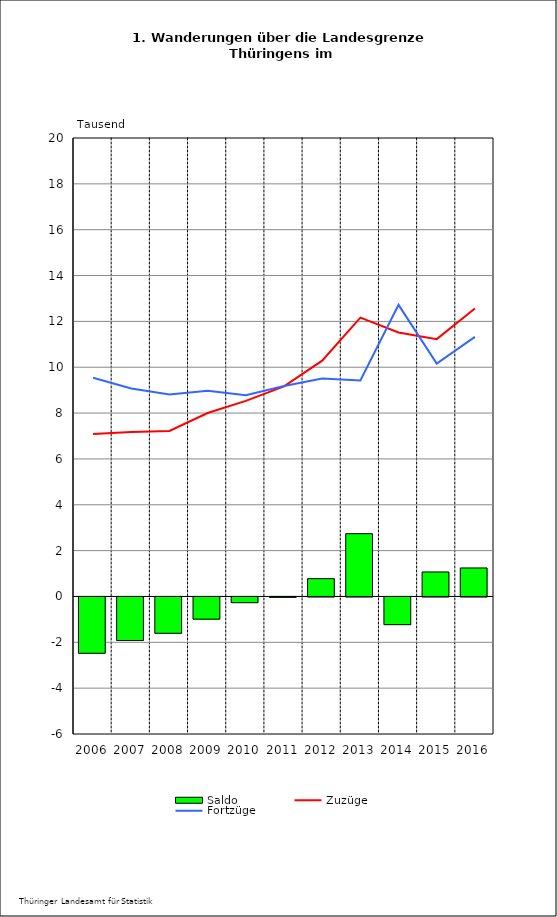
| Category | Saldo |
|---|---|
| 2006.0 | -2.456 |
| 2007.0 | -1.9 |
| 2008.0 | -1.585 |
| 2009.0 | -0.968 |
| 2010.0 | -0.249 |
| 2011.0 | -0.016 |
| 2012.0 | 0.777 |
| 2013.0 | 2.738 |
| 2014.0 | -1.207 |
| 2015.0 | 1.069 |
| 2016.0 | 1.243 |